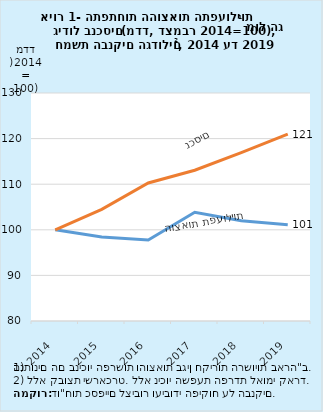
| Category | מדד- הוצאות תפעוליות | מדד- סך הנכסים |
|---|---|---|
| 2014-12-31 | 100 | 100 |
| 2015-12-31 | 98.399 | 104.498 |
| 2016-12-31 | 97.781 | 110.266 |
| 2017-12-31 | 103.838 | 113.067 |
| 2018-12-31 | 101.998 | 116.908 |
| 2019-12-31 | 101.121 | 120.983 |